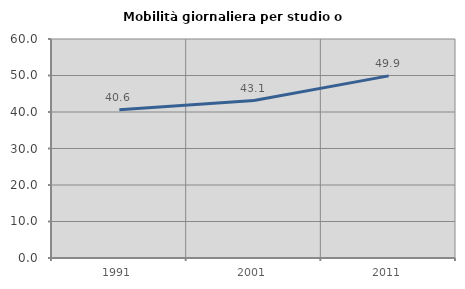
| Category | Mobilità giornaliera per studio o lavoro |
|---|---|
| 1991.0 | 40.632 |
| 2001.0 | 43.128 |
| 2011.0 | 49.892 |